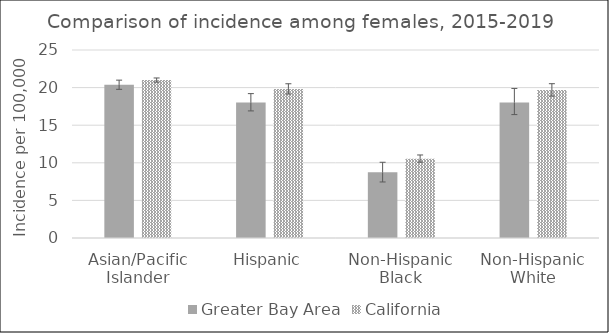
| Category | Greater Bay Area | California | SEER 18 |
|---|---|---|---|
| Asian/Pacific Islander | 20.37 | 21 |  |
| Hispanic | 18.03 | 19.82 |  |
| Non-Hispanic Black | 8.73 | 10.55 |  |
| Non-Hispanic White | 18.02 | 19.67 |  |